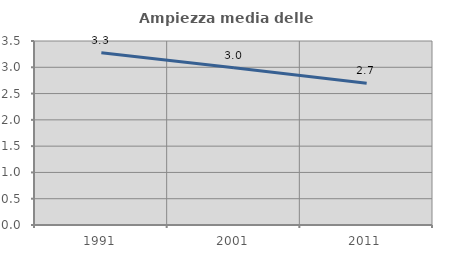
| Category | Ampiezza media delle famiglie |
|---|---|
| 1991.0 | 3.276 |
| 2001.0 | 2.99 |
| 2011.0 | 2.696 |